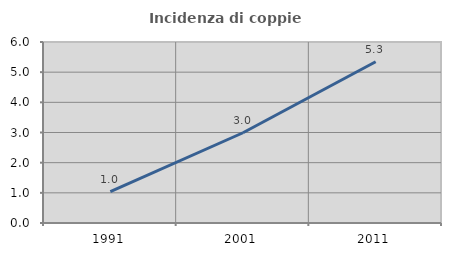
| Category | Incidenza di coppie miste |
|---|---|
| 1991.0 | 1.041 |
| 2001.0 | 2.992 |
| 2011.0 | 5.345 |